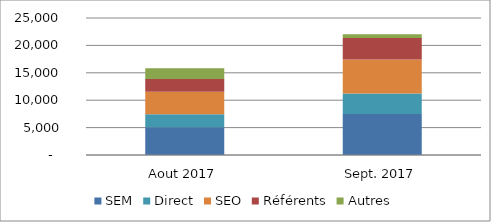
| Category |  SEM  |  Direct  |  SEO  |  Référents  |  Autres  |
|---|---|---|---|---|---|
| Aout 2017 | 5064.64 | 2374.05 | 4115.02 | 2318.931 | 1954.359 |
| Sept. 2017 | 7491.22 | 3745.61 | 6169.24 | 3965.94 | 660.99 |